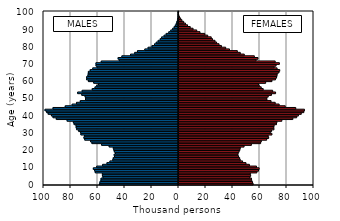
| Category | -5 219 791  | 5 390 264  |
|---|---|---|
| 0.0 | -58549 | 55664 |
| 1.0 | -58221 | 55212 |
| 2.0 | -57502 | 54635 |
| 3.0 | -57382 | 54443 |
| 4.0 | -55943 | 53212 |
| 5.0 | -56343 | 53826 |
| 6.0 | -56392 | 53568 |
| 7.0 | -61653 | 58421 |
| 8.0 | -62107 | 59635 |
| 9.0 | -63090 | 60121 |
| 10.0 | -60615 | 58176 |
| 11.0 | -56220 | 52916 |
| 12.0 | -52997 | 50367 |
| 13.0 | -50808 | 47839 |
| 14.0 | -48722 | 46098 |
| 15.0 | -48318 | 45659 |
| 16.0 | -47387 | 44841 |
| 17.0 | -47631 | 44377 |
| 18.0 | -46632 | 44556 |
| 19.0 | -47538 | 45261 |
| 20.0 | -47938 | 45834 |
| 21.0 | -48302 | 46155 |
| 22.0 | -51358 | 48946 |
| 23.0 | -56948 | 54361 |
| 24.0 | -64147 | 61209 |
| 25.0 | -65177 | 61724 |
| 26.0 | -69438 | 65685 |
| 27.0 | -70056 | 67159 |
| 28.0 | -69652 | 66776 |
| 29.0 | -72318 | 69579 |
| 30.0 | -72455 | 68331 |
| 31.0 | -73933 | 69325 |
| 32.0 | -75432 | 71083 |
| 33.0 | -75808 | 70962 |
| 34.0 | -75904 | 71212 |
| 35.0 | -77340 | 72970 |
| 36.0 | -77862 | 73246 |
| 37.0 | -82516 | 76928 |
| 38.0 | -90534 | 85090 |
| 39.0 | -92969 | 87909 |
| 40.0 | -94150 | 89195 |
| 41.0 | -96571 | 91301 |
| 42.0 | -97693 | 93204 |
| 43.0 | -98893 | 93675 |
| 44.0 | -92981 | 87233 |
| 45.0 | -83922 | 79414 |
| 46.0 | -78791 | 74942 |
| 47.0 | -75561 | 72009 |
| 48.0 | -72765 | 68929 |
| 49.0 | -68868 | 65869 |
| 50.0 | -68865 | 65811 |
| 51.0 | -69202 | 66819 |
| 52.0 | -71645 | 69242 |
| 53.0 | -74705 | 72290 |
| 54.0 | -71371 | 70117 |
| 55.0 | -63911 | 63094 |
| 56.0 | -61861 | 61641 |
| 57.0 | -60576 | 60190 |
| 58.0 | -59215 | 59570 |
| 59.0 | -62826 | 64939 |
| 60.0 | -66729 | 69590 |
| 61.0 | -68112 | 72219 |
| 62.0 | -68025 | 73013 |
| 63.0 | -67132 | 73358 |
| 64.0 | -66855 | 73535 |
| 65.0 | -66763 | 74803 |
| 66.0 | -65409 | 75370 |
| 67.0 | -63502 | 73404 |
| 68.0 | -60325 | 71208 |
| 69.0 | -61105 | 72659 |
| 70.0 | -61145 | 75106 |
| 71.0 | -57241 | 71996 |
| 72.0 | -43880 | 57815 |
| 73.0 | -44723 | 59253 |
| 74.0 | -41947 | 56555 |
| 75.0 | -35550 | 49102 |
| 76.0 | -32445 | 46130 |
| 77.0 | -30396 | 43952 |
| 78.0 | -24966 | 38132 |
| 79.0 | -22545 | 35334 |
| 80.0 | -19630 | 32163 |
| 81.0 | -17759 | 30402 |
| 82.0 | -16493 | 28590 |
| 83.0 | -15078 | 27407 |
| 84.0 | -13531 | 25535 |
| 85.0 | -12499 | 24595 |
| 86.0 | -10679 | 22006 |
| 87.0 | -9134 | 19821 |
| 88.0 | -7190 | 16294 |
| 89.0 | -5730 | 13891 |
| 90.0 | -4350 | 11161 |
| 91.0 | -3227 | 9040 |
| 92.0 | -2372 | 7069 |
| 93.0 | -1646 | 5527 |
| 94.0 | -1258 | 4202 |
| 95.0 | -782 | 2900 |
| 96.0 | -504 | 1958 |
| 97.0 | -262 | 1102 |
| 98.0 | -144 | 563 |
| 99.0 | -57 | 213 |
| 100.0 | -162 | 496 |